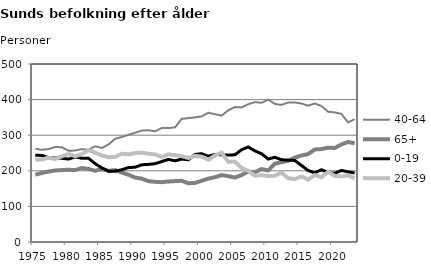
| Category | 40-64 | 65+ | 0-19 | 20-39 |
|---|---|---|---|---|
| 1975.0 | 262 | 189 | 244 | 231 |
| 1976.0 | 259 | 194 | 243 | 232 |
| 1977.0 | 261 | 198 | 237 | 237 |
| 1978.0 | 267 | 201 | 236 | 233 |
| 1979.0 | 266 | 202 | 235 | 241 |
| 1980.0 | 256 | 203 | 233 | 247 |
| 1981.0 | 257 | 202 | 239 | 241 |
| 1982.0 | 261 | 208 | 235 | 247 |
| 1983.0 | 259 | 205 | 235 | 258 |
| 1984.0 | 269 | 200 | 220 | 251 |
| 1985.0 | 264 | 205 | 208 | 243 |
| 1986.0 | 274 | 200 | 199 | 238 |
| 1987.0 | 290 | 202 | 199 | 239 |
| 1988.0 | 295 | 195 | 203 | 248 |
| 1989.0 | 301 | 189 | 209 | 246 |
| 1990.0 | 307 | 181 | 210 | 250 |
| 1991.0 | 313 | 178 | 217 | 251 |
| 1992.0 | 314 | 171 | 218 | 248 |
| 1993.0 | 311 | 169 | 220 | 246 |
| 1994.0 | 320 | 168 | 226 | 239 |
| 1995.0 | 320 | 170 | 232 | 246 |
| 1996.0 | 322 | 171 | 228 | 244 |
| 1997.0 | 346 | 172 | 233 | 241 |
| 1998.0 | 348 | 165 | 231 | 236 |
| 1999.0 | 350 | 166 | 246 | 242 |
| 2000.0 | 353 | 172 | 248 | 240 |
| 2001.0 | 363 | 178 | 241 | 231 |
| 2002.0 | 359 | 182 | 246 | 243 |
| 2003.0 | 355 | 188 | 245 | 251 |
| 2004.0 | 370 | 185 | 244 | 225 |
| 2005.0 | 379 | 181 | 245 | 226 |
| 2006.0 | 378 | 188 | 259 | 208 |
| 2007.0 | 387 | 198 | 267 | 200 |
| 2008.0 | 393 | 196 | 256 | 186 |
| 2009.0 | 391 | 205 | 248 | 188 |
| 2010.0 | 400 | 201 | 233 | 185 |
| 2011.0 | 388 | 220 | 238 | 186 |
| 2012.0 | 385 | 224 | 231 | 195 |
| 2013.0 | 392 | 228 | 230 | 179 |
| 2014.0 | 392 | 237 | 229 | 177 |
| 2015.0 | 389 | 243 | 215 | 184 |
| 2016.0 | 383 | 247 | 201 | 175 |
| 2017.0 | 389 | 260 | 194 | 188 |
| 2018.0 | 382 | 261 | 203 | 182 |
| 2019.0 | 366 | 265 | 195 | 197 |
| 2020.0 | 364 | 264 | 193 | 186 |
| 2021.0 | 360 | 274 | 201 | 184 |
| 2022.0 | 336 | 281 | 197 | 187 |
| 2023.0 | 345 | 277 | 194 | 179 |